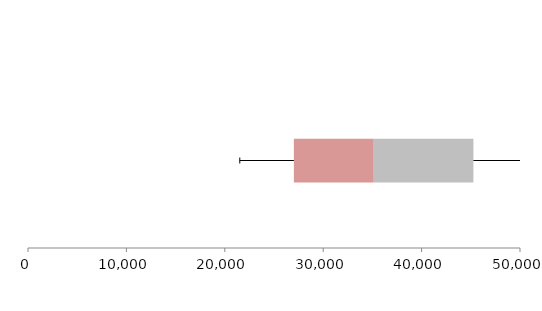
| Category | Series 1 | Series 2 | Series 3 |
|---|---|---|---|
| 0 | 27019.65 | 8118.491 | 10125.93 |